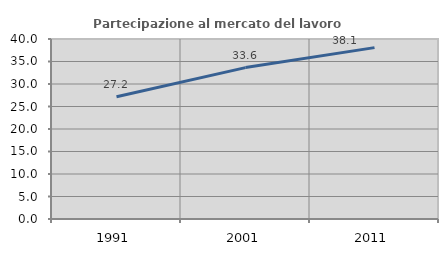
| Category | Partecipazione al mercato del lavoro  femminile |
|---|---|
| 1991.0 | 27.178 |
| 2001.0 | 33.647 |
| 2011.0 | 38.086 |